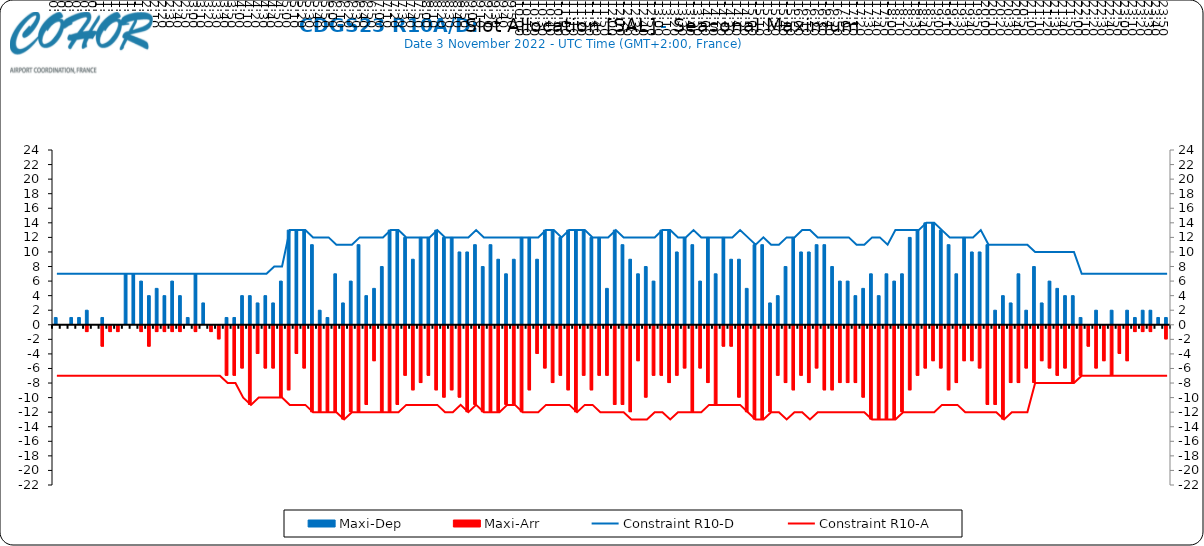
| Category | Maxi-Dep | Maxi-Arr |
|---|---|---|
| 0.0 | 1 | 0 |
| 0.006944444444444444 | 0 | 0 |
| 0.013888888888888888 | 1 | 0 |
| 0.020833333333333332 | 1 | 0 |
| 0.027777777777777776 | 2 | -1 |
| 0.034722222222222224 | 0 | 0 |
| 0.041666666666666664 | 1 | -3 |
| 0.04861111111111111 | 0 | -1 |
| 0.05555555555555555 | 0 | -1 |
| 0.0625 | 7 | 0 |
| 0.06944444444444443 | 7 | 0 |
| 0.0763888888888889 | 6 | -1 |
| 0.08333333333333333 | 4 | -3 |
| 0.09027777777777778 | 5 | -1 |
| 0.09722222222222222 | 4 | -1 |
| 0.10416666666666667 | 6 | -1 |
| 0.1111111111111111 | 4 | -1 |
| 0.11805555555555557 | 1 | 0 |
| 0.125 | 7 | -1 |
| 0.13194444444444445 | 3 | 0 |
| 0.1388888888888889 | 0 | -1 |
| 0.14583333333333334 | 0 | -2 |
| 0.15277777777777776 | 1 | -7 |
| 0.15972222222222224 | 1 | -7 |
| 0.16666666666666666 | 4 | -6 |
| 0.17361111111111113 | 4 | -11 |
| 0.18055555555555555 | 3 | -4 |
| 0.1875 | 4 | -6 |
| 0.19444444444444445 | 3 | -6 |
| 0.20138888888888887 | 6 | -10 |
| 0.20833333333333334 | 13 | -9 |
| 0.2152777777777778 | 13 | -4 |
| 0.2222222222222222 | 13 | -6 |
| 0.22916666666666666 | 11 | -12 |
| 0.23611111111111113 | 2 | -12 |
| 0.24305555555555555 | 1 | -12 |
| 0.25 | 7 | -12 |
| 0.2569444444444445 | 3 | -13 |
| 0.2638888888888889 | 6 | -12 |
| 0.2708333333333333 | 11 | -12 |
| 0.2777777777777778 | 4 | -11 |
| 0.2847222222222222 | 5 | -5 |
| 0.2916666666666667 | 8 | -12 |
| 0.2986111111111111 | 13 | -12 |
| 0.3055555555555555 | 13 | -11 |
| 0.3125 | 12 | -7 |
| 0.3194444444444445 | 9 | -9 |
| 0.3263888888888889 | 12 | -8 |
| 0.3333333333333333 | 12 | -7 |
| 0.34027777777777773 | 13 | -9 |
| 0.34722222222222227 | 12 | -10 |
| 0.3541666666666667 | 12 | -9 |
| 0.3611111111111111 | 10 | -10 |
| 0.3680555555555556 | 10 | -12 |
| 0.375 | 11 | -11 |
| 0.3819444444444444 | 8 | -12 |
| 0.3888888888888889 | 11 | -12 |
| 0.3958333333333333 | 9 | -12 |
| 0.40277777777777773 | 7 | -11 |
| 0.40972222222222227 | 9 | -11 |
| 0.4166666666666667 | 12 | -12 |
| 0.4236111111111111 | 12 | -9 |
| 0.4305555555555556 | 9 | -4 |
| 0.4375 | 13 | -6 |
| 0.4444444444444444 | 13 | -8 |
| 0.4513888888888889 | 12 | -7 |
| 0.4583333333333333 | 13 | -9 |
| 0.46527777777777773 | 13 | -12 |
| 0.47222222222222227 | 13 | -7 |
| 0.4791666666666667 | 12 | -9 |
| 0.4861111111111111 | 12 | -7 |
| 0.4930555555555556 | 5 | -7 |
| 0.5 | 13 | -11 |
| 0.5069444444444444 | 11 | -11 |
| 0.513888888888889 | 9 | -12 |
| 0.5208333333333334 | 7 | -5 |
| 0.5277777777777778 | 8 | -10 |
| 0.5347222222222222 | 6 | -7 |
| 0.5416666666666666 | 13 | -7 |
| 0.548611111111111 | 13 | -8 |
| 0.5555555555555556 | 10 | -7 |
| 0.5625 | 12 | -6 |
| 0.5694444444444444 | 11 | -12 |
| 0.576388888888889 | 6 | -6 |
| 0.5833333333333334 | 12 | -8 |
| 0.5902777777777778 | 7 | -11 |
| 0.5972222222222222 | 12 | -3 |
| 0.6041666666666666 | 9 | -3 |
| 0.611111111111111 | 9 | -10 |
| 0.6180555555555556 | 5 | -12 |
| 0.625 | 11 | -13 |
| 0.6319444444444444 | 11 | -13 |
| 0.638888888888889 | 3 | -12 |
| 0.6458333333333334 | 4 | -7 |
| 0.6527777777777778 | 8 | -8 |
| 0.6597222222222222 | 12 | -9 |
| 0.6666666666666666 | 10 | -7 |
| 0.6736111111111112 | 10 | -8 |
| 0.6805555555555555 | 11 | -6 |
| 0.6875 | 11 | -9 |
| 0.6944444444444445 | 8 | -9 |
| 0.7013888888888888 | 6 | -8 |
| 0.7083333333333334 | 6 | -8 |
| 0.7152777777777778 | 4 | -8 |
| 0.7222222222222222 | 5 | -10 |
| 0.7291666666666666 | 7 | -13 |
| 0.7361111111111112 | 4 | -13 |
| 0.7430555555555555 | 7 | -13 |
| 0.75 | 6 | -13 |
| 0.7569444444444445 | 7 | -12 |
| 0.7638888888888888 | 12 | -9 |
| 0.7708333333333334 | 13 | -7 |
| 0.7777777777777778 | 14 | -6 |
| 0.7847222222222222 | 14 | -5 |
| 0.7916666666666666 | 13 | -6 |
| 0.7986111111111112 | 11 | -9 |
| 0.8055555555555555 | 7 | -8 |
| 0.8125 | 12 | -5 |
| 0.8194444444444445 | 10 | -5 |
| 0.8263888888888888 | 10 | -6 |
| 0.8333333333333334 | 11 | -11 |
| 0.8402777777777778 | 2 | -11 |
| 0.8472222222222222 | 4 | -13 |
| 0.8541666666666666 | 3 | -8 |
| 0.8611111111111112 | 7 | -8 |
| 0.8680555555555555 | 2 | -6 |
| 0.875 | 8 | -8 |
| 0.8819444444444445 | 3 | -5 |
| 0.8888888888888888 | 6 | -6 |
| 0.8958333333333334 | 5 | -7 |
| 0.9027777777777778 | 4 | -6 |
| 0.9097222222222222 | 4 | -8 |
| 0.9166666666666666 | 1 | -7 |
| 0.9236111111111112 | 0 | -3 |
| 0.9305555555555555 | 2 | -6 |
| 0.9375 | 0 | -5 |
| 0.9444444444444445 | 2 | -7 |
| 0.9513888888888888 | 0 | -4 |
| 0.9583333333333334 | 2 | -5 |
| 0.9652777777777778 | 1 | -1 |
| 0.9722222222222222 | 2 | -1 |
| 0.9791666666666666 | 2 | -1 |
| 0.9861111111111112 | 1 | 0 |
| 0.9930555555555555 | 1 | -2 |